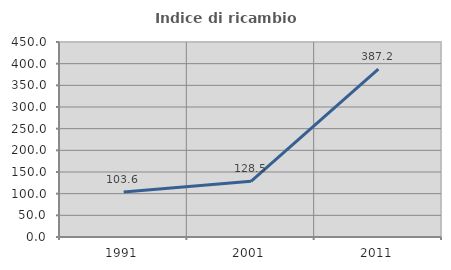
| Category | Indice di ricambio occupazionale  |
|---|---|
| 1991.0 | 103.635 |
| 2001.0 | 128.512 |
| 2011.0 | 387.189 |